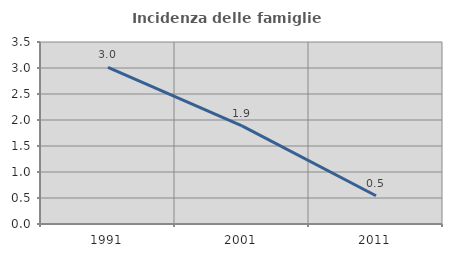
| Category | Incidenza delle famiglie numerose |
|---|---|
| 1991.0 | 3.012 |
| 2001.0 | 1.887 |
| 2011.0 | 0.543 |